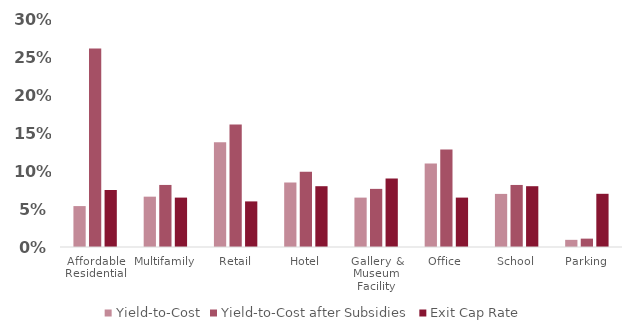
| Category | Yield-to-Cost | Yield-to-Cost after Subsidies | Exit Cap Rate |
|---|---|---|---|
| Affordable Residential | 0.054 | 0.261 | 0.075 |
| Multifamily | 0.066 | 0.082 | 0.065 |
| Retail | 0.138 | 0.161 | 0.06 |
| Hotel | 0.085 | 0.099 | 0.08 |
| Gallery & Museum Facility | 0.065 | 0.076 | 0.09 |
| Office | 0.11 | 0.128 | 0.065 |
| School | 0.07 | 0.082 | 0.08 |
| Parking | 0.009 | 0.011 | 0.07 |